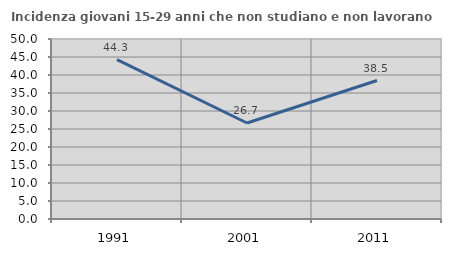
| Category | Incidenza giovani 15-29 anni che non studiano e non lavorano  |
|---|---|
| 1991.0 | 44.277 |
| 2001.0 | 26.667 |
| 2011.0 | 38.462 |